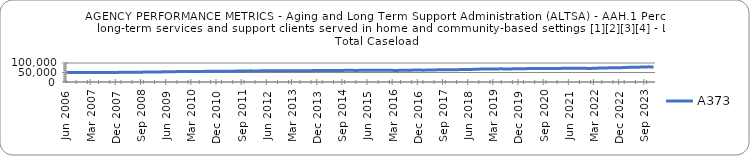
| Category | A373 |
|---|---|
| 0.76721 | 49362.033 |
| 0.76724 | 49334.581 |
| 0.76937 | 49604.71 |
| 0.77188 | 49649.767 |
| 0.77291 | 49848.548 |
| 0.77287 | 49801.8 |
| 0.77281 | 49729.355 |
| 0.77321 | 49461.581 |
| 0.77487 | 49462.464 |
| 0.77588 | 49607.161 |
| 0.77547 | 49617.633 |
| 0.77665 | 49765.452 |
| 0.77799 | 49754.9 |
| 0.78001 | 49816.71 |
| 0.78165 | 49998.355 |
| 0.78378 | 50143.1 |
| 0.78567 | 50551.533 |
| 0.78719 | 50571.009 |
| 0.7887 | 50595.586 |
| 0.79022 | 50714.554 |
| 0.79129 | 50752.891 |
| 0.79193 | 50974.453 |
| 0.79455 | 51077.452 |
| 0.79439 | 51206.126 |
| 0.79457 | 51129.704 |
| 0.79632 | 51351.611 |
| 0.79721 | 51622.265 |
| 0.79865 | 51847.016 |
| 0.79917 | 52216.955 |
| 0.79965 | 52324.434 |
| 0.79991 | 52473.888 |
| 0.80036 | 52354.689 |
| 0.80119 | 52525.403 |
| 0.80135 | 52962.02 |
| 0.80196 | 53196.3 |
| 0.80282 | 53458.707 |
| 0.80375 | 53647.335 |
| 0.80441 | 53932.176 |
| 0.80454 | 54201.54 |
| 0.80574 | 54453.03 |
| 0.80717 | 54753.02 |
| 0.80907 | 54794.035 |
| 0.80996 | 54860.468 |
| 0.81048 | 54697.185 |
| 0.81132 | 54677.316 |
| 0.81235 | 55056.208 |
| 0.81422 | 55118.248 |
| 0.81521 | 55384.378 |
| 0.81511 | 55603.054 |
| 0.816 | 55877.972 |
| 0.81562 | 56051.937 |
| 0.8177 | 56209.443 |
| 0.81902 | 56402.215 |
| 0.81999 | 56300.742 |
| 0.8202 | 56309.877 |
| 0.82092 | 56286.677 |
| 0.82336 | 56095.831 |
| 0.82379 | 56662.836 |
| 0.82545 | 56830.417 |
| 0.82578 | 57084.966 |
| 0.82632 | 57159.383 |
| 0.82543 | 57283 |
| 0.82484 | 57789 |
| 0.82636 | 57908 |
| 0.82733 | 58437 |
| 0.82838 | 58387 |
| 0.82888 | 58704 |
| 0.82809 | 58201 |
| 0.82917 | 58215 |
| 0.82866 | 58552 |
| 0.82858 | 58643 |
| 0.82802 | 58793 |
| 0.82938 | 58870 |
| 0.83046 | 58861 |
| 0.83086 | 59098 |
| 0.83171 | 58896 |
| 0.83162 | 59240 |
| 0.83156 | 59093 |
| 0.8309 | 59039 |
| 0.83222 | 59061 |
| 0.83276 | 58840 |
| 0.83338 | 58958 |
| 0.83336 | 59100 |
| 0.83239 | 59343 |
| 0.83251 | 59356 |
| 0.8337 | 59459.372 |
| 0.83426 | 59622.174 |
| 0.83557 | 59624.788 |
| 0.83627 | 59910.46 |
| 0.83614 | 59988.5 |
| 0.83597 | 60038.76 |
| 0.83796 | 60113.692 |
| 0.83821 | 59937 |
| 0.83855 | 60235.789 |
| 0.84014 | 60277 |
| 0.83995 | 60502 |
| 0.84007 | 60599 |
| 0.8402 | 60854 |
| 0.841 | 60846 |
| 0.8424 | 61073 |
| 0.8431 | 61384 |
| 0.8435 | 61286 |
| 0.8439 | 61516 |
| 0.84383 | 60920 |
| 0.84463 | 60924 |
| 0.84443 | 61524 |
| 0.84487 | 61871 |
| 0.84543 | 62035 |
| 0.8466 | 62099 |
| 0.84682 | 61511 |
| 0.84816 | 61677 |
| 0.84589 | 61671 |
| 0.84646 | 62030 |
| 0.84772 | 62010 |
| 0.8486 | 62026 |
| 0.84786 | 61750 |
| 0.84849 | 62006 |
| 0.84851 | 60781 |
| 0.8492 | 61000 |
| 0.84852 | 61195 |
| 0.84989 | 61504 |
| 0.85076 | 61550 |
| 0.85196 | 61984 |
| 0.8534 | 62323 |
| 0.85355 | 62526 |
| 0.85326 | 62706 |
| 0.85294 | 62640 |
| 0.85119 | 62518 |
| 0.85152 | 62402 |
| 0.85143 | 62967 |
| 0.85182 | 63060 |
| 0.8521 | 63308 |
| 0.85264 | 63557 |
| 0.85441 | 64181.471 |
| 0.85526 | 64557.79 |
| 0.85728 | 64596.568 |
| 0.8577 | 64883.403 |
| 0.85845 | 64999.076 |
| 0.85828 | 64967.814 |
| 0.85799 | 64968.687 |
| 0.85772 | 64922.06 |
| 0.85887 | 65332.941 |
| 0.86116 | 65432.087 |
| 0.86123 | 65742.625 |
| 0.86193 | 65849.616 |
| 0.86372 | 66307.756 |
| 0.86147 | 66619.274 |
| 0.86303 | 67242.075 |
| 0.86431 | 67884.332 |
| 0.86533 | 67762.533 |
| 0.86473 | 68187.484 |
| 0.86411 | 68825.355 |
| 0.86504 | 67976 |
| 0.86518 | 68503.645 |
| 0.86641 | 68784.067 |
| 0.86717 | 69129.677 |
| 0.86792 | 69064.067 |
| 0.8694 | 68312.757 |
| 0.86921 | 68667.226 |
| 0.87375 | 68924.267 |
| 0.87927 | 69312.516 |
| 0.88196 | 69376.222 |
| 0.8826 | 69431.987 |
| 0.88378 | 70100.258 |
| 0.88511 | 69760.276 |
| 0.8857 | 70720.194 |
| 0.88923 | 70694.233 |
| 0.89424 | 70677.871 |
| 0.89466 | 71029.867 |
| 0.89512 | 70914.387 |
| 0.89475 | 70909.065 |
| 0.89525 | 71050.333 |
| 0.89485 | 71108.533 |
| 0.89346 | 70660.871 |
| 0.89386 | 70938.871 |
| 0.89048 | 70592.677 |
| 0.89013 | 70912.357 |
| 0.89185 | 71757.387 |
| 0.8934 | 71883.4 |
| 0.89298 | 72038.645 |
| 0.89372 | 72491.333 |
| 0.89661 | 72240.677 |
| 0.89824 | 72271.645 |
| 0.89708 | 72064.067 |
| 0.89662 | 72019.645 |
| 0.89759 | 71739.7 |
| 0.89814 | 71730.645 |
| 0.89823 | 71333.935 |
| 0.89819 | 71633.036 |
| 0.89789 | 72605.226 |
| 0.89829 | 73091.4 |
| 0.89874 | 73398.516 |
| 0.90061 | 73680.833 |
| 0.90125 | 73900.742 |
| 0.90115 | 74429.548 |
| 0.90196 | 74607.1 |
| 0.90133 | 74884.452 |
| 0.90135 | 75075.833 |
| 0.90118 | 75412.226 |
| 0.90219 | 75710.129 |
| 0.90296 | 75887.786 |
| 0.90356 | 77106.935 |
| 0.90607 | 77146.167 |
| 0.90755 | 77940.71 |
| 0.91023 | 78104.533 |
| nan | 78251.871 |
| nan | 78880.194 |
| nan | 78922.3 |
| nan | 79634.452 |
| nan | 79544.067 |
| nan | 79391.323 |